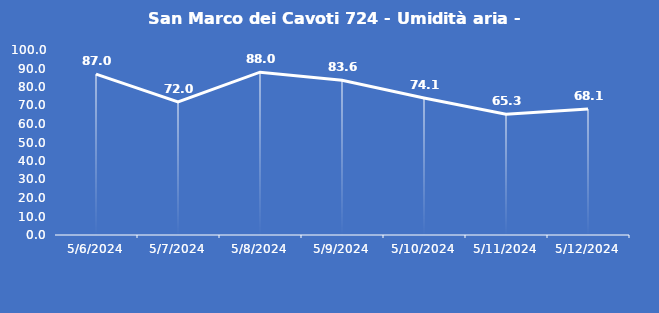
| Category | San Marco dei Cavoti 724 - Umidità aria - Grezzo (%) |
|---|---|
| 5/6/24 | 87 |
| 5/7/24 | 72 |
| 5/8/24 | 88 |
| 5/9/24 | 83.6 |
| 5/10/24 | 74.1 |
| 5/11/24 | 65.3 |
| 5/12/24 | 68.1 |